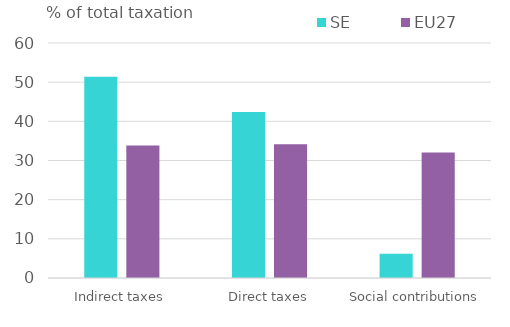
| Category | SE | EU27 |
|---|---|---|
| Indirect taxes | 51.396 | 33.811 |
| Direct taxes | 42.396 | 34.133 |
| Social contributions | 6.208 | 32.056 |